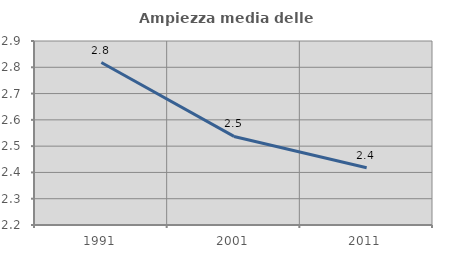
| Category | Ampiezza media delle famiglie |
|---|---|
| 1991.0 | 2.818 |
| 2001.0 | 2.537 |
| 2011.0 | 2.418 |